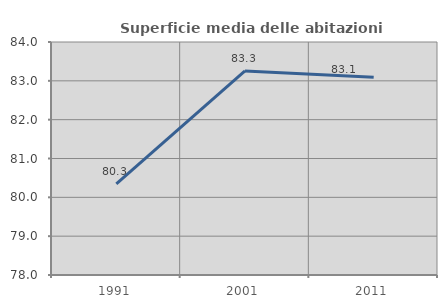
| Category | Superficie media delle abitazioni occupate |
|---|---|
| 1991.0 | 80.347 |
| 2001.0 | 83.255 |
| 2011.0 | 83.093 |